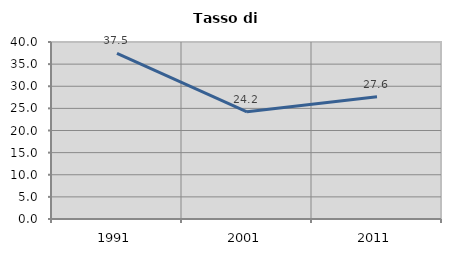
| Category | Tasso di disoccupazione   |
|---|---|
| 1991.0 | 37.45 |
| 2001.0 | 24.227 |
| 2011.0 | 27.604 |